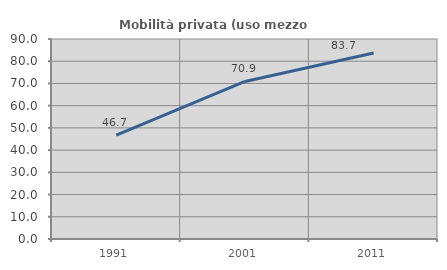
| Category | Mobilità privata (uso mezzo privato) |
|---|---|
| 1991.0 | 46.729 |
| 2001.0 | 70.909 |
| 2011.0 | 83.704 |